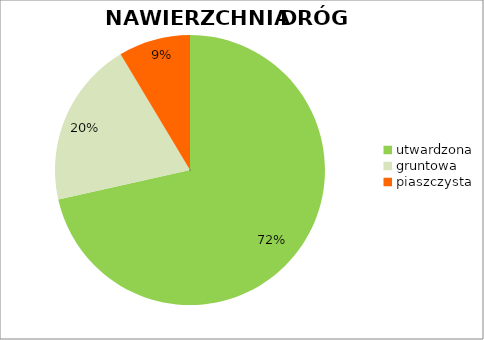
| Category | Series 0 |
|---|---|
| utwardzona | 0.715 |
| gruntowa | 0.199 |
| piaszczysta | 0.086 |